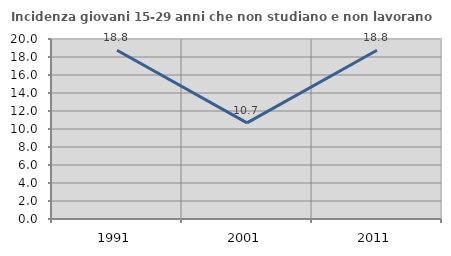
| Category | Incidenza giovani 15-29 anni che non studiano e non lavorano  |
|---|---|
| 1991.0 | 18.75 |
| 2001.0 | 10.687 |
| 2011.0 | 18.75 |